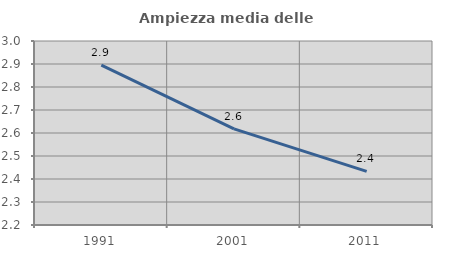
| Category | Ampiezza media delle famiglie |
|---|---|
| 1991.0 | 2.895 |
| 2001.0 | 2.618 |
| 2011.0 | 2.433 |